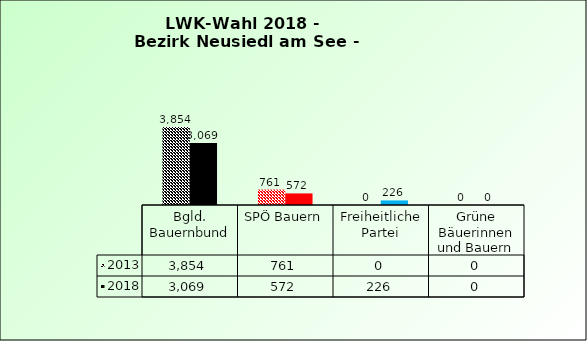
| Category | 2013 | 2018 |
|---|---|---|
| Bgld. Bauernbund | 3854 | 3069 |
| SPÖ Bauern | 761 | 572 |
| Freiheitliche Partei | 0 | 226 |
| Grüne Bäuerinnen und Bauern | 0 | 0 |